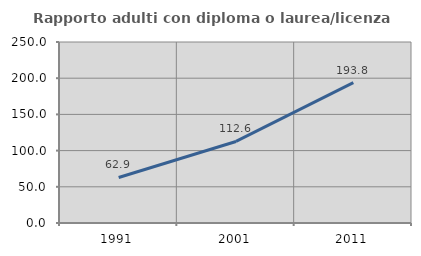
| Category | Rapporto adulti con diploma o laurea/licenza media  |
|---|---|
| 1991.0 | 62.901 |
| 2001.0 | 112.625 |
| 2011.0 | 193.763 |